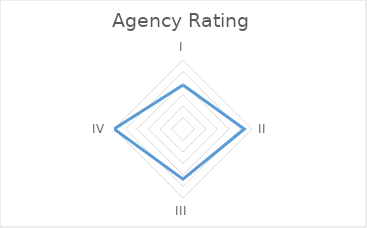
| Category | Series 0 |
|---|---|
| I | 1.909 |
| II | 2.667 |
| III | 2.182 |
| IV | 3 |